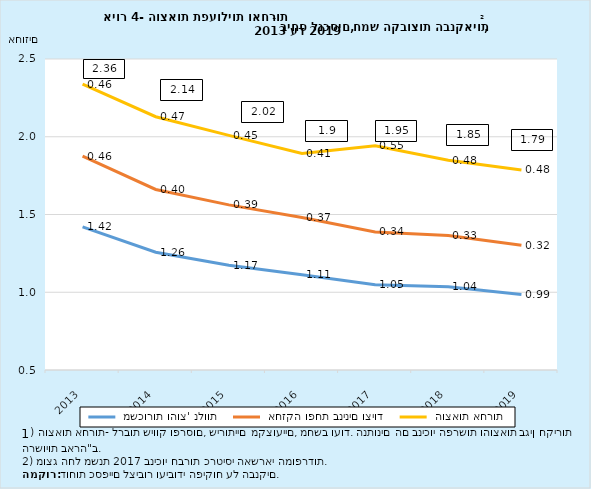
| Category |  משכורות והוצ' נלוות |  אחזקה ופחת בנינים וציוד |  הוצאות אחרות |
|---|---|---|---|
| 2013-12-31 | 1.42 | 0.455 | 0.463 |
| 2014-12-31 | 1.258 | 0.403 | 0.468 |
| 2015-12-31 | 1.174 | 0.388 | 0.447 |
| 2016-12-31 | 1.113 | 0.367 | 0.412 |
| 2017-12-31 | 1.049 | 0.339 | 0.553 |
| 2018-12-31 | 1.035 | 0.329 | 0.484 |
| 2019-12-31 | 0.986 | 0.316 | 0.485 |